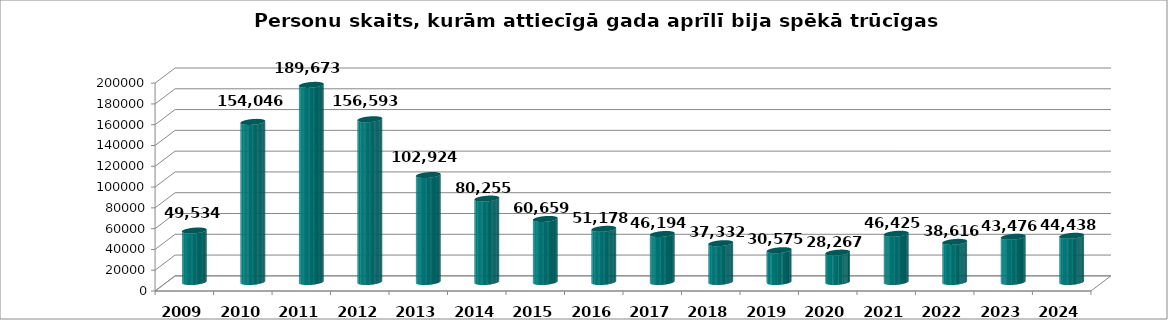
| Category | aprīlis |
|---|---|
| 2009.0 | 49534 |
| 2010.0 | 154046 |
| 2011.0 | 189673 |
| 2012.0 | 156593 |
| 2013.0 | 102924 |
| 2014.0 | 80255 |
| 2015.0 | 60659 |
| 2016.0 | 51178 |
| 2017.0 | 46194 |
| 2018.0 | 37332 |
| 2019.0 | 30575 |
| 2020.0 | 28267 |
| 2021.0 | 46425 |
| 2022.0 | 38616 |
| 2023.0 | 43476 |
| 2024.0 | 44438 |